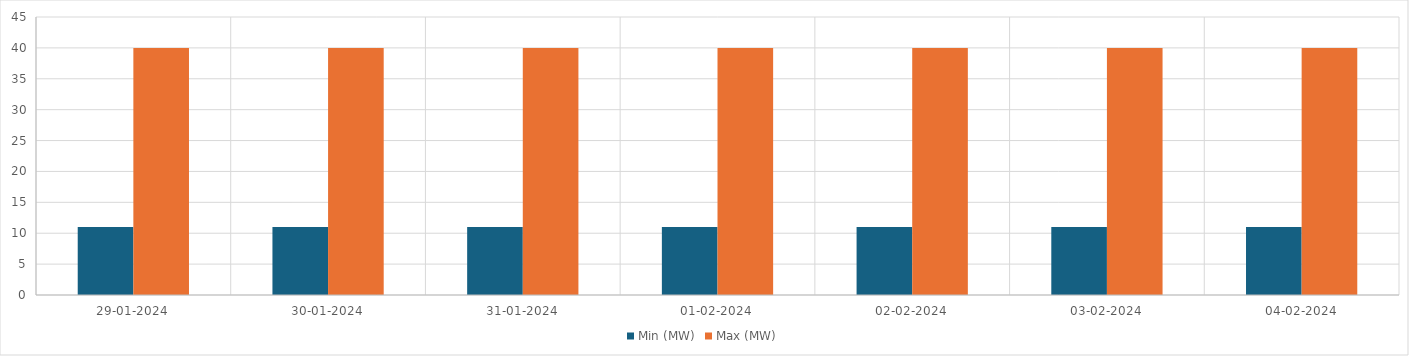
| Category | Min (MW) | Max (MW) |
|---|---|---|
| 29-01-2024 | 11 | 40 |
| 30-01-2024 | 11 | 40 |
| 31-01-2024 | 11 | 40 |
| 01-02-2024 | 11 | 40 |
| 02-02-2024 | 11 | 40 |
| 03-02-2024 | 11 | 40 |
| 04-02-2024 | 11 | 40 |